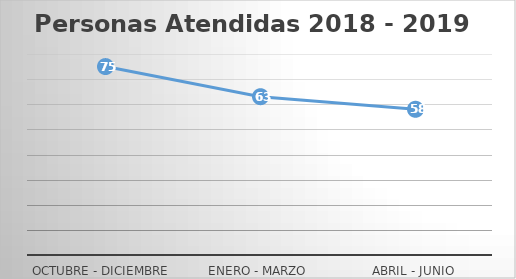
| Category | Series 0 |
|---|---|
| Octubre - Diciembre  | 75 |
| Enero - Marzo | 63 |
| Abril - Junio | 58 |